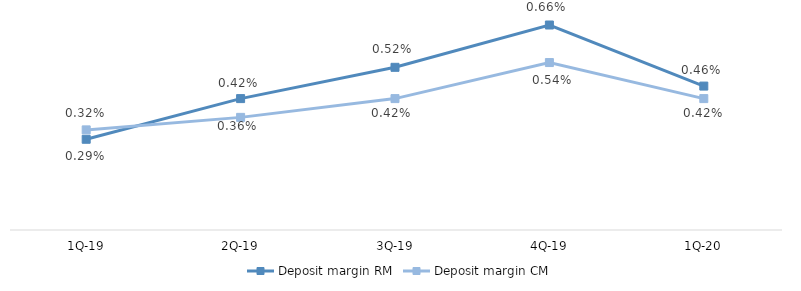
| Category | Deposit margin RM | Deposit margin CM |
|---|---|---|
| 1Q-20 | 0.005 | 0.004 |
| 4Q-19 | 0.007 | 0.005 |
| 3Q-19 | 0.005 | 0.004 |
| 2Q-19 | 0.004 | 0.004 |
| 1Q-19 | 0.003 | 0.003 |